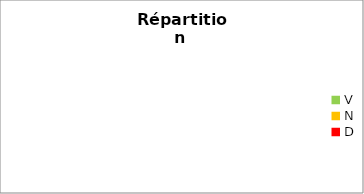
| Category | Series 0 |
|---|---|
| V | 0 |
| N | 0 |
| D | 0 |